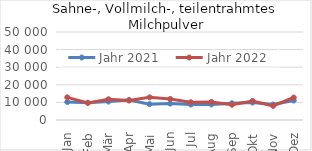
| Category | Jahr 2021 | Jahr 2022 |
|---|---|---|
| Jan | 10206.425 | 12874.945 |
| Feb | 9822.072 | 9722.893 |
| Mär | 10464.196 | 11778.275 |
| Apr | 11396.984 | 11055.242 |
| Mai | 9003.127 | 12872.533 |
| Jun | 9344.478 | 11928.252 |
| Jul | 8809.553 | 10061.744 |
| Aug | 8865.855 | 10268.339 |
| Sep | 9511.85 | 8668.728 |
| Okt | 9935.646 | 10812.345 |
| Nov | 8761.017 | 8018.609 |
| Dez | 11066.545 | 12776.499 |